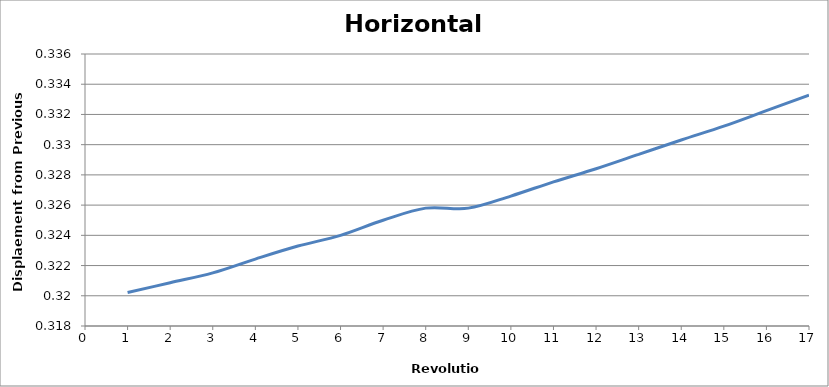
| Category | Displacement from Previous |
|---|---|
| 1.0 | 0.32 |
| 2.0 | 0.321 |
| 3.0 | 0.322 |
| 4.0 | 0.322 |
| 5.0 | 0.323 |
| 6.0 | 0.324 |
| 7.0 | 0.325 |
| 8.0 | 0.326 |
| 9.0 | 0.326 |
| 10.0 | 0.327 |
| 11.0 | 0.328 |
| 12.0 | 0.328 |
| 13.0 | 0.329 |
| 14.0 | 0.33 |
| 15.0 | 0.331 |
| 16.0 | 0.332 |
| 17.0 | 0.333 |